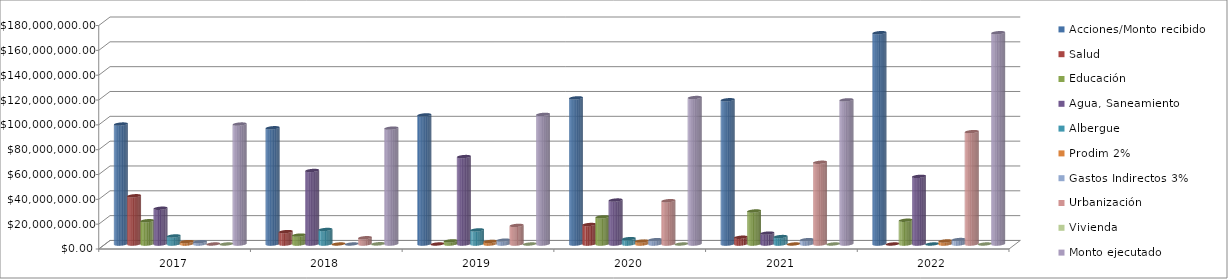
| Category | Acciones/Monto recibido | Salud | Educación | Agua, Saneamiento | Albergue | Prodim 2% | Gastos Indirectos 3% | Urbanización | Vivienda | Monto ejecutado |
|---|---|---|---|---|---|---|---|---|---|---|
| 2017.0 | 96614115.07 | 38837022.19 | 18734217.57 | 28801845.33 | 6486220.72 | 1919928.36 | 1834880.2 | 0 | 0 | 96614114.37 |
| 2018.0 | 93623075 | 9982460.7 | 7166014.37 | 59221166.75 | 11689698.6 | 0 | 0 | 5053714.61 | 210090.08 | 93323145.11 |
| 2019.0 | 103976713 | 0 | 2499728.63 | 70423471.31 | 11340140.85 | 2051806.74 | 3111789.75 | 14971766.8 | 0 | 104398704.08 |
| 2020.0 | 117685776 | 15699897 | 21848532 | 35398167 | 4315560 | 2350715 | 3496439 | 34876466 | 0 | 117985776 |
| 2021.0 | 116186319 | 5434197.88 | 26591282.82 | 8776676.92 | 5989501.18 | 0 | 3485450.78 | 65832192.97 | 0 | 116109302.55 |
| 2022.0 | 170188814.83 | 0 | 19152034.3 | 54475784.84 | 0 | 2452320.06 | 3597065.24 | 90511610.3 | 0 | 170188814.74 |